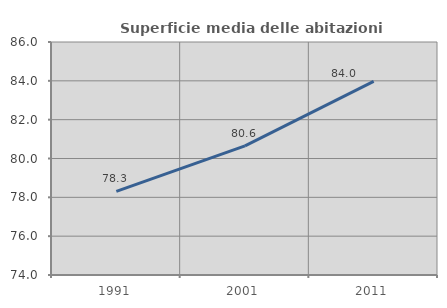
| Category | Superficie media delle abitazioni occupate |
|---|---|
| 1991.0 | 78.31 |
| 2001.0 | 80.648 |
| 2011.0 | 83.971 |